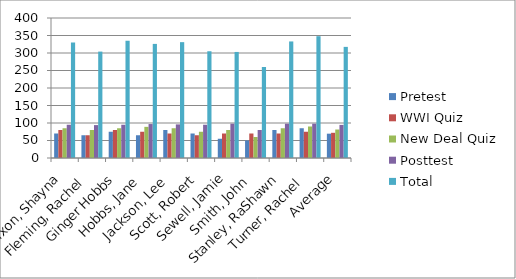
| Category | Pretest | WWI Quiz | New Deal Quiz | Posttest | Total |
|---|---|---|---|---|---|
| Dixon, Shayna | 70 | 80 | 85 | 95 | 330 |
| Fleming, Rachel  | 65 | 65 | 80 | 94 | 304 |
| Ginger Hobbs | 75 | 80 | 85 | 95 | 335 |
| Hobbs, Jane  | 65 | 75 | 89 | 97 | 326 |
| Jackson, Lee  | 80 | 70 | 85 | 96 | 331 |
| Scott, Robert  | 70 | 65 | 75 | 95 | 305 |
| Sewell, Jamie  | 55 | 70 | 80 | 98 | 303 |
| Smith, John  | 50 | 70 | 60 | 80 | 260 |
| Stanley, RaShawn | 80 | 70 | 85 | 98 | 333 |
| Turner, Rachel  | 85 | 75 | 90 | 98 | 348 |
| Average | 69.5 | 72 | 81.4 | 94.6 | 317.5 |